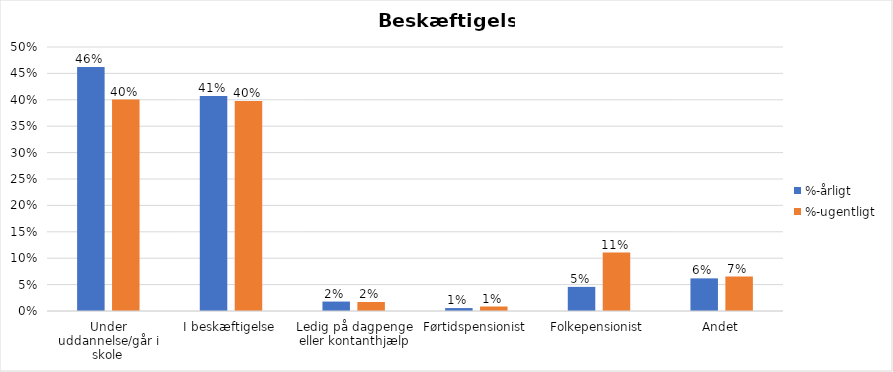
| Category | %-årligt | %-ugentligt |
|---|---|---|
| Under uddannelse/går i skole | 0.462 | 0.401 |
| I beskæftigelse | 0.407 | 0.398 |
| Ledig på dagpenge eller kontanthjælp | 0.018 | 0.017 |
| Førtidspensionist | 0.006 | 0.009 |
| Folkepensionist | 0.046 | 0.111 |
| Andet | 0.062 | 0.065 |